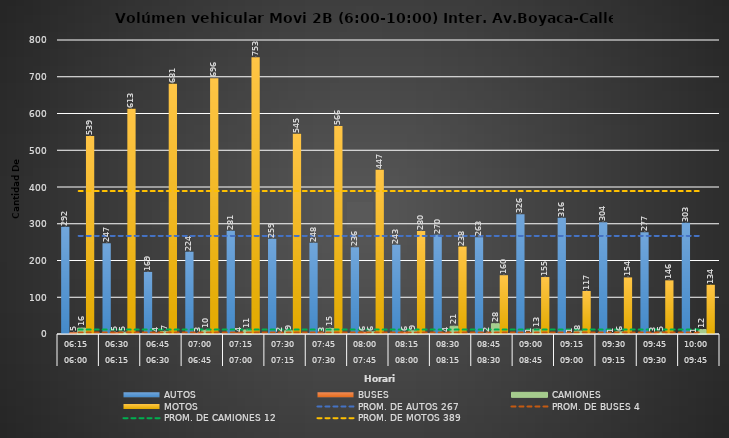
| Category | AUTOS | BUSES | CAMIONES | MOTOS |
|---|---|---|---|---|
| 0 | 292 | 5 | 16 | 539 |
| 1 | 247 | 5 | 5 | 613 |
| 2 | 169 | 4 | 7 | 681 |
| 3 | 224 | 3 | 10 | 696 |
| 4 | 281 | 4 | 11 | 753 |
| 5 | 259 | 2 | 9 | 545 |
| 6 | 248 | 3 | 15 | 566 |
| 7 | 236 | 6 | 6 | 447 |
| 8 | 243 | 6 | 9 | 280 |
| 9 | 270 | 4 | 21 | 238 |
| 10 | 263 | 2 | 28 | 160 |
| 11 | 326 | 1 | 13 | 155 |
| 12 | 316 | 1 | 8 | 117 |
| 13 | 304 | 1 | 6 | 154 |
| 14 | 277 | 3 | 5 | 146 |
| 15 | 303 | 1 | 12 | 134 |